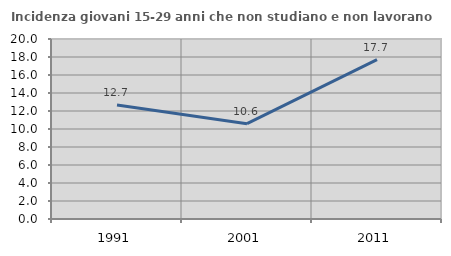
| Category | Incidenza giovani 15-29 anni che non studiano e non lavorano  |
|---|---|
| 1991.0 | 12.678 |
| 2001.0 | 10.595 |
| 2011.0 | 17.709 |